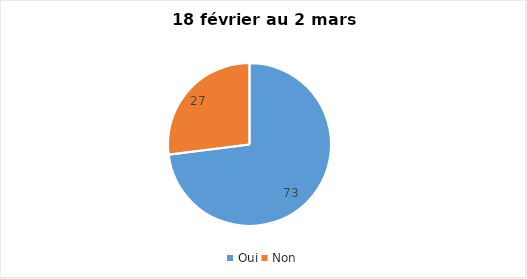
| Category | Series 0 |
|---|---|
| Oui | 73 |
| Non | 27 |